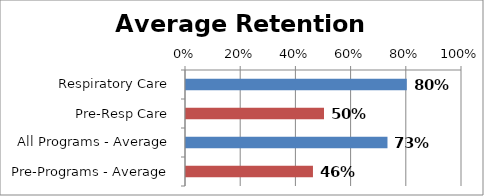
| Category | Series 0 |
|---|---|
| Respiratory Care | 0.8 |
| Pre-Resp Care | 0.5 |
| All Programs - Average | 0.73 |
| Pre-Programs - Average | 0.46 |